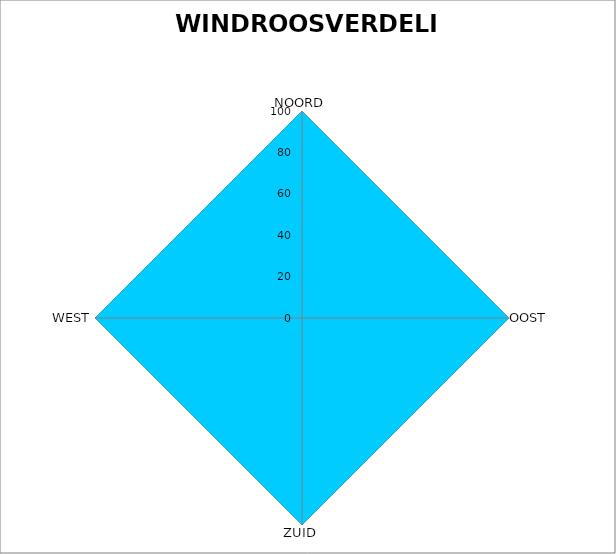
| Category | WINDROOSVERDELING |
|---|---|
| 0 | 100 |
| 1 | 100 |
| 2 | 100 |
| 3 | 100 |